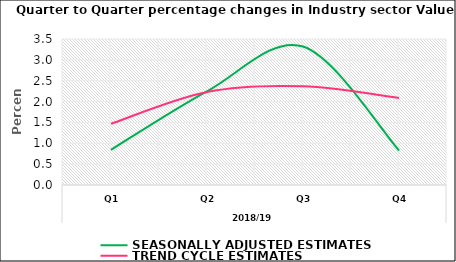
| Category | SEASONALLY ADJUSTED ESTIMATES | TREND CYCLE ESTIMATES |
|---|---|---|
| 0 | 0.844 | 1.467 |
| 1 | 2.246 | 2.229 |
| 2 | 3.319 | 2.365 |
| 3 | 0.827 | 2.087 |